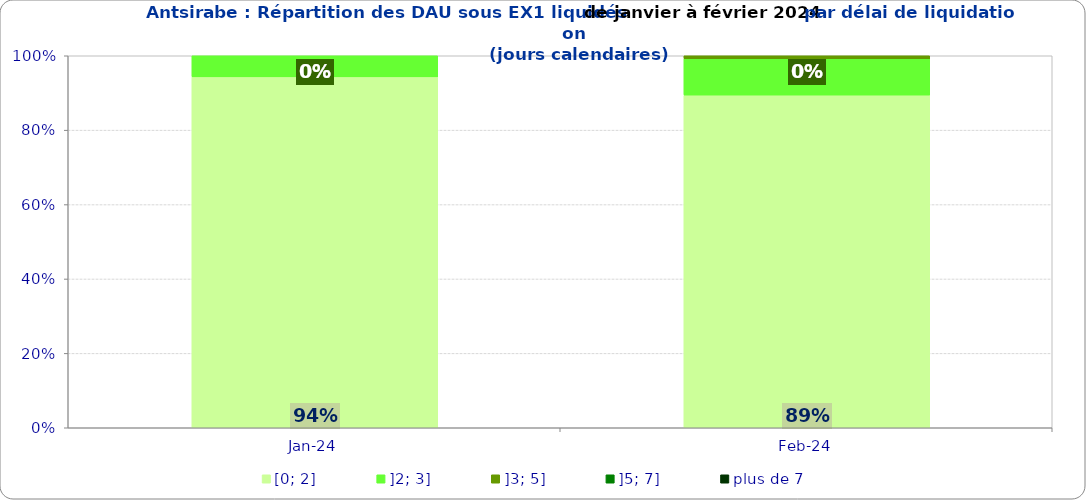
| Category | [0; 2] | ]2; 3] | ]3; 5] | ]5; 7] | plus de 7 |
|---|---|---|---|---|---|
| 2024-01-01 | 0.943 | 0.057 | 0 | 0 | 0 |
| 2024-02-01 | 0.894 | 0.098 | 0.008 | 0 | 0 |